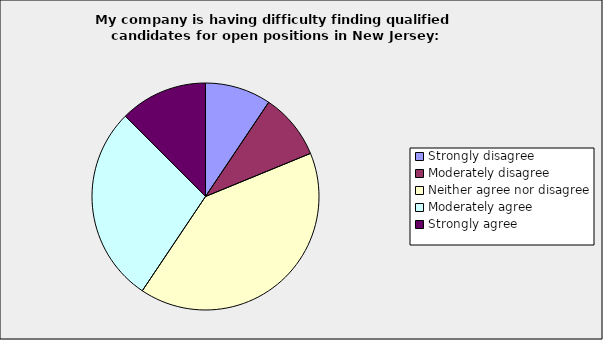
| Category | Series 0 |
|---|---|
| Strongly disagree | 0.094 |
| Moderately disagree | 0.094 |
| Neither agree nor disagree | 0.406 |
| Moderately agree | 0.281 |
| Strongly agree | 0.125 |